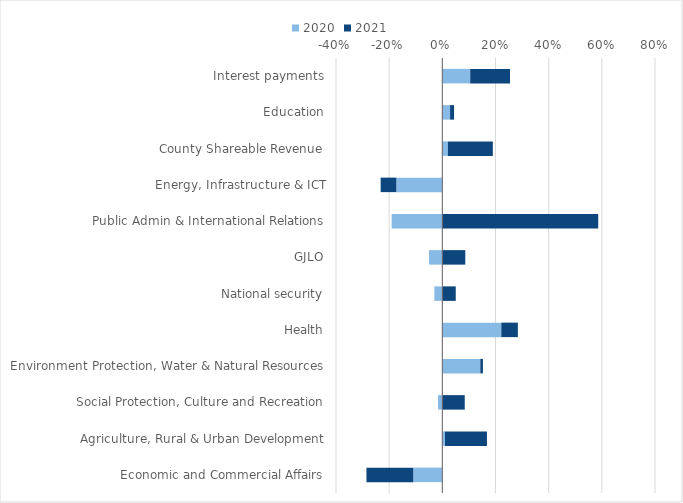
| Category | 2020 | 2021 |
|---|---|---|
| Economic and Commercial Affairs | -0.109 | -0.176 |
| Agriculture, Rural & Urban Development | 0.01 | 0.158 |
| Social Protection, Culture and Recreation | -0.016 | 0.084 |
| Environment Protection, Water & Natural Resources | 0.143 | 0.01 |
| Health | 0.222 | 0.062 |
| National security | -0.03 | 0.05 |
| GJLO | -0.05 | 0.086 |
| Public Admin & International Relations | -0.191 | 0.586 |
| Energy, Infrastructure & ICT | -0.173 | -0.059 |
| County Shareable Revenue | 0.021 | 0.169 |
| Education | 0.029 | 0.015 |
| Interest payments | 0.105 | 0.15 |